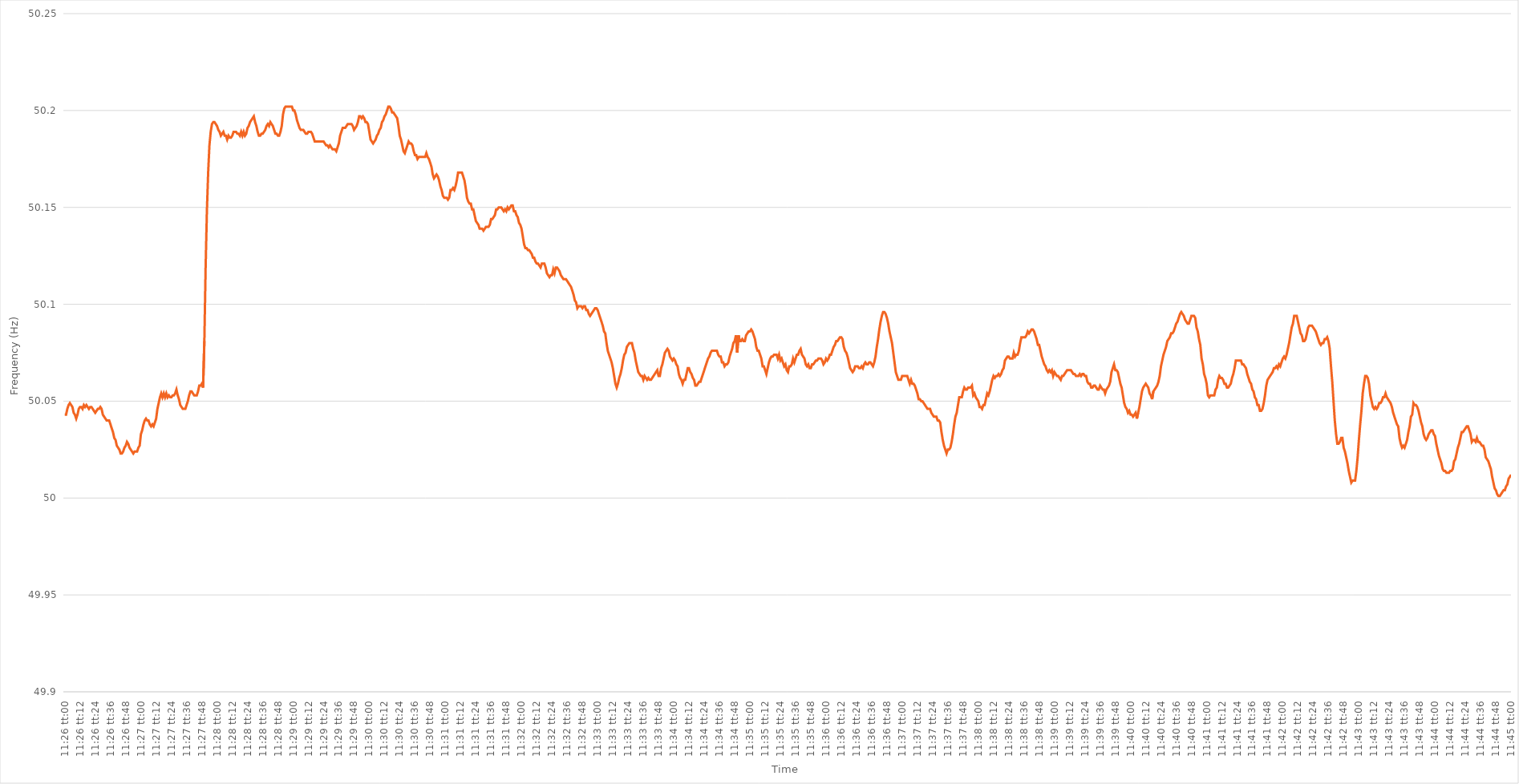
| Category | Series 0 |
|---|---|
| 0.4763888888888889 | 50.043 |
| 0.47640046296296296 | 50.043 |
| 0.47641203703703705 | 50.046 |
| 0.4764236111111111 | 50.048 |
| 0.4764351851851852 | 50.049 |
| 0.4764467592592592 | 50.048 |
| 0.4764583333333334 | 50.047 |
| 0.4764699074074074 | 50.044 |
| 0.4764814814814815 | 50.043 |
| 0.47649305555555554 | 50.041 |
| 0.47650462962962964 | 50.043 |
| 0.4765162037037037 | 50.046 |
| 0.47652777777777783 | 50.047 |
| 0.47653935185185187 | 50.047 |
| 0.47655092592592596 | 50.046 |
| 0.4765625 | 50.048 |
| 0.47657407407407404 | 50.047 |
| 0.47658564814814813 | 50.048 |
| 0.47659722222222217 | 50.047 |
| 0.4766087962962963 | 50.046 |
| 0.47662037037037036 | 50.047 |
| 0.47663194444444446 | 50.047 |
| 0.4766435185185185 | 50.046 |
| 0.4766550925925926 | 50.045 |
| 0.4766666666666666 | 50.044 |
| 0.4766782407407408 | 50.045 |
| 0.4766898148148148 | 50.046 |
| 0.4767013888888889 | 50.046 |
| 0.47671296296296295 | 50.047 |
| 0.47672453703703704 | 50.046 |
| 0.4767361111111111 | 50.043 |
| 0.47674768518518523 | 50.042 |
| 0.47675925925925927 | 50.041 |
| 0.47677083333333337 | 50.04 |
| 0.4767824074074074 | 50.04 |
| 0.4767939814814815 | 50.04 |
| 0.47680555555555554 | 50.038 |
| 0.4768171296296296 | 50.036 |
| 0.4768287037037037 | 50.034 |
| 0.47684027777777777 | 50.031 |
| 0.47685185185185186 | 50.03 |
| 0.4768634259259259 | 50.027 |
| 0.476875 | 50.026 |
| 0.47688657407407403 | 50.025 |
| 0.4768981481481482 | 50.023 |
| 0.4769097222222222 | 50.023 |
| 0.4769212962962963 | 50.024 |
| 0.47693287037037035 | 50.026 |
| 0.47694444444444445 | 50.027 |
| 0.4769560185185185 | 50.029 |
| 0.47696759259259264 | 50.028 |
| 0.4769791666666667 | 50.026 |
| 0.47699074074074077 | 50.025 |
| 0.4770023148148148 | 50.024 |
| 0.4770138888888889 | 50.023 |
| 0.47702546296296294 | 50.024 |
| 0.477037037037037 | 50.024 |
| 0.47704861111111113 | 50.024 |
| 0.47706018518518517 | 50.026 |
| 0.47707175925925926 | 50.027 |
| 0.4770833333333333 | 50.033 |
| 0.4770949074074074 | 50.035 |
| 0.47710648148148144 | 50.038 |
| 0.4771180555555556 | 50.04 |
| 0.4771296296296296 | 50.041 |
| 0.4771412037037037 | 50.04 |
| 0.47715277777777776 | 50.04 |
| 0.47716435185185185 | 50.038 |
| 0.4771759259259259 | 50.037 |
| 0.47718750000000004 | 50.038 |
| 0.4771990740740741 | 50.037 |
| 0.4772106481481482 | 50.039 |
| 0.4772222222222222 | 50.041 |
| 0.4772337962962963 | 50.046 |
| 0.47724537037037035 | 50.049 |
| 0.4772569444444445 | 50.052 |
| 0.47726851851851854 | 50.054 |
| 0.47728009259259263 | 50.052 |
| 0.47729166666666667 | 50.054 |
| 0.4773032407407407 | 50.052 |
| 0.4773148148148148 | 50.054 |
| 0.47732638888888884 | 50.052 |
| 0.477337962962963 | 50.053 |
| 0.47734953703703703 | 50.052 |
| 0.4773611111111111 | 50.052 |
| 0.47737268518518516 | 50.053 |
| 0.47738425925925926 | 50.053 |
| 0.4773958333333333 | 50.054 |
| 0.47740740740740745 | 50.056 |
| 0.4774189814814815 | 50.053 |
| 0.4774305555555556 | 50.051 |
| 0.4774421296296296 | 50.048 |
| 0.4774537037037037 | 50.047 |
| 0.47746527777777775 | 50.046 |
| 0.4774768518518519 | 50.046 |
| 0.47748842592592594 | 50.046 |
| 0.47750000000000004 | 50.048 |
| 0.4775115740740741 | 50.05 |
| 0.4775231481481481 | 50.053 |
| 0.4775347222222222 | 50.055 |
| 0.47754629629629625 | 50.055 |
| 0.4775578703703704 | 50.054 |
| 0.47756944444444444 | 50.053 |
| 0.47758101851851853 | 50.053 |
| 0.47759259259259257 | 50.053 |
| 0.47760416666666666 | 50.055 |
| 0.4776157407407407 | 50.058 |
| 0.47762731481481485 | 50.058 |
| 0.4776388888888889 | 50.059 |
| 0.477650462962963 | 50.057 |
| 0.477662037037037 | 50.081 |
| 0.4776736111111111 | 50.119 |
| 0.47768518518518516 | 50.148 |
| 0.4776967592592593 | 50.168 |
| 0.47770833333333335 | 50.182 |
| 0.47771990740740744 | 50.189 |
| 0.4777314814814815 | 50.193 |
| 0.4777430555555555 | 50.194 |
| 0.4777546296296296 | 50.194 |
| 0.47776620370370365 | 50.193 |
| 0.4777777777777778 | 50.192 |
| 0.47778935185185184 | 50.19 |
| 0.47780092592592593 | 50.189 |
| 0.4778125 | 50.187 |
| 0.47782407407407407 | 50.188 |
| 0.4778356481481481 | 50.189 |
| 0.47784722222222226 | 50.187 |
| 0.4778587962962963 | 50.187 |
| 0.4778703703703704 | 50.185 |
| 0.47788194444444443 | 50.187 |
| 0.4778935185185185 | 50.186 |
| 0.47790509259259256 | 50.186 |
| 0.4779166666666667 | 50.187 |
| 0.47792824074074075 | 50.189 |
| 0.47793981481481485 | 50.189 |
| 0.4779513888888889 | 50.189 |
| 0.477962962962963 | 50.188 |
| 0.477974537037037 | 50.188 |
| 0.47798611111111117 | 50.187 |
| 0.4779976851851852 | 50.189 |
| 0.47800925925925924 | 50.187 |
| 0.47802083333333334 | 50.189 |
| 0.4780324074074074 | 50.187 |
| 0.4780439814814815 | 50.188 |
| 0.4780555555555555 | 50.191 |
| 0.47806712962962966 | 50.192 |
| 0.4780787037037037 | 50.194 |
| 0.4780902777777778 | 50.195 |
| 0.47810185185185183 | 50.196 |
| 0.47811342592592593 | 50.197 |
| 0.47812499999999997 | 50.194 |
| 0.4781365740740741 | 50.192 |
| 0.47814814814814816 | 50.189 |
| 0.47815972222222225 | 50.187 |
| 0.4781712962962963 | 50.187 |
| 0.4781828703703704 | 50.188 |
| 0.4781944444444444 | 50.188 |
| 0.47820601851851857 | 50.189 |
| 0.4782175925925926 | 50.19 |
| 0.47822916666666665 | 50.192 |
| 0.47824074074074074 | 50.193 |
| 0.4782523148148148 | 50.192 |
| 0.4782638888888889 | 50.194 |
| 0.4782754629629629 | 50.193 |
| 0.47828703703703707 | 50.192 |
| 0.4782986111111111 | 50.19 |
| 0.4783101851851852 | 50.188 |
| 0.47832175925925924 | 50.188 |
| 0.47833333333333333 | 50.187 |
| 0.47834490740740737 | 50.187 |
| 0.4783564814814815 | 50.189 |
| 0.47836805555555556 | 50.192 |
| 0.47837962962962965 | 50.198 |
| 0.4783912037037037 | 50.201 |
| 0.4784027777777778 | 50.202 |
| 0.4784143518518518 | 50.202 |
| 0.478425925925926 | 50.202 |
| 0.4784375 | 50.202 |
| 0.47844907407407405 | 50.202 |
| 0.47846064814814815 | 50.202 |
| 0.4784722222222222 | 50.2 |
| 0.4784837962962963 | 50.2 |
| 0.4784953703703703 | 50.198 |
| 0.47850694444444447 | 50.195 |
| 0.4785185185185185 | 50.193 |
| 0.4785300925925926 | 50.191 |
| 0.47854166666666664 | 50.19 |
| 0.47855324074074074 | 50.19 |
| 0.4785648148148148 | 50.19 |
| 0.4785763888888889 | 50.189 |
| 0.47858796296296297 | 50.188 |
| 0.47859953703703706 | 50.188 |
| 0.4786111111111111 | 50.189 |
| 0.4786226851851852 | 50.189 |
| 0.47863425925925923 | 50.189 |
| 0.4786458333333334 | 50.188 |
| 0.4786574074074074 | 50.186 |
| 0.4786689814814815 | 50.184 |
| 0.47868055555555555 | 50.184 |
| 0.47869212962962965 | 50.184 |
| 0.4787037037037037 | 50.184 |
| 0.4787152777777777 | 50.184 |
| 0.4787268518518519 | 50.184 |
| 0.4787384259259259 | 50.184 |
| 0.47875 | 50.184 |
| 0.47876157407407405 | 50.183 |
| 0.47877314814814814 | 50.182 |
| 0.4787847222222222 | 50.182 |
| 0.47879629629629633 | 50.181 |
| 0.47880787037037037 | 50.182 |
| 0.47881944444444446 | 50.181 |
| 0.4788310185185185 | 50.18 |
| 0.4788425925925926 | 50.18 |
| 0.47885416666666664 | 50.18 |
| 0.4788657407407408 | 50.179 |
| 0.4788773148148148 | 50.181 |
| 0.4788888888888889 | 50.183 |
| 0.47890046296296296 | 50.187 |
| 0.47891203703703705 | 50.189 |
| 0.4789236111111111 | 50.191 |
| 0.47893518518518513 | 50.191 |
| 0.4789467592592593 | 50.191 |
| 0.4789583333333333 | 50.192 |
| 0.4789699074074074 | 50.193 |
| 0.47898148148148145 | 50.193 |
| 0.47899305555555555 | 50.193 |
| 0.4790046296296296 | 50.193 |
| 0.47901620370370374 | 50.192 |
| 0.4790277777777778 | 50.19 |
| 0.47903935185185187 | 50.191 |
| 0.4790509259259259 | 50.192 |
| 0.4790625 | 50.194 |
| 0.47907407407407404 | 50.197 |
| 0.4790856481481482 | 50.197 |
| 0.47909722222222223 | 50.196 |
| 0.4791087962962963 | 50.197 |
| 0.47912037037037036 | 50.196 |
| 0.47913194444444446 | 50.194 |
| 0.4791435185185185 | 50.194 |
| 0.47915509259259265 | 50.193 |
| 0.4791666666666667 | 50.189 |
| 0.4791782407407407 | 50.185 |
| 0.4791898148148148 | 50.184 |
| 0.47920138888888886 | 50.183 |
| 0.47921296296296295 | 50.184 |
| 0.479224537037037 | 50.185 |
| 0.47923611111111114 | 50.187 |
| 0.4792476851851852 | 50.188 |
| 0.4792592592592593 | 50.19 |
| 0.4792708333333333 | 50.191 |
| 0.4792824074074074 | 50.194 |
| 0.47929398148148145 | 50.195 |
| 0.4793055555555556 | 50.197 |
| 0.47931712962962963 | 50.198 |
| 0.47932870370370373 | 50.2 |
| 0.47934027777777777 | 50.202 |
| 0.47935185185185186 | 50.202 |
| 0.4793634259259259 | 50.201 |
| 0.47937500000000005 | 50.199 |
| 0.4793865740740741 | 50.199 |
| 0.4793981481481482 | 50.198 |
| 0.4794097222222222 | 50.197 |
| 0.47942129629629626 | 50.196 |
| 0.47943287037037036 | 50.192 |
| 0.4794444444444444 | 50.187 |
| 0.47945601851851855 | 50.185 |
| 0.4794675925925926 | 50.182 |
| 0.4794791666666667 | 50.179 |
| 0.4794907407407407 | 50.178 |
| 0.4795023148148148 | 50.18 |
| 0.47951388888888885 | 50.182 |
| 0.479525462962963 | 50.184 |
| 0.47953703703703704 | 50.183 |
| 0.47954861111111113 | 50.183 |
| 0.4795601851851852 | 50.182 |
| 0.47957175925925927 | 50.179 |
| 0.4795833333333333 | 50.177 |
| 0.47959490740740746 | 50.177 |
| 0.4796064814814815 | 50.175 |
| 0.4796180555555556 | 50.176 |
| 0.47962962962962963 | 50.176 |
| 0.47964120370370367 | 50.176 |
| 0.47965277777777776 | 50.176 |
| 0.4796643518518518 | 50.176 |
| 0.47967592592592595 | 50.176 |
| 0.4796875 | 50.178 |
| 0.4796990740740741 | 50.176 |
| 0.4797106481481481 | 50.175 |
| 0.4797222222222222 | 50.173 |
| 0.47973379629629626 | 50.171 |
| 0.4797453703703704 | 50.167 |
| 0.47975694444444444 | 50.165 |
| 0.47976851851851854 | 50.166 |
| 0.4797800925925926 | 50.167 |
| 0.47979166666666667 | 50.166 |
| 0.4798032407407407 | 50.164 |
| 0.47981481481481486 | 50.161 |
| 0.4798263888888889 | 50.159 |
| 0.479837962962963 | 50.156 |
| 0.47984953703703703 | 50.155 |
| 0.4798611111111111 | 50.155 |
| 0.47987268518518517 | 50.155 |
| 0.4798842592592593 | 50.154 |
| 0.47989583333333335 | 50.155 |
| 0.4799074074074074 | 50.159 |
| 0.4799189814814815 | 50.159 |
| 0.4799305555555555 | 50.16 |
| 0.4799421296296296 | 50.159 |
| 0.47995370370370366 | 50.161 |
| 0.4799652777777778 | 50.164 |
| 0.47997685185185185 | 50.168 |
| 0.47998842592592594 | 50.168 |
| 0.48 | 50.168 |
| 0.4800115740740741 | 50.168 |
| 0.4800231481481481 | 50.166 |
| 0.48003472222222227 | 50.164 |
| 0.4800462962962963 | 50.16 |
| 0.4800578703703704 | 50.155 |
| 0.48006944444444444 | 50.153 |
| 0.48008101851851853 | 50.152 |
| 0.48009259259259257 | 50.152 |
| 0.4801041666666667 | 50.149 |
| 0.48011574074074076 | 50.149 |
| 0.4801273148148148 | 50.146 |
| 0.4801388888888889 | 50.143 |
| 0.48015046296296293 | 50.142 |
| 0.480162037037037 | 50.141 |
| 0.48017361111111106 | 50.139 |
| 0.4801851851851852 | 50.139 |
| 0.48019675925925925 | 50.139 |
| 0.48020833333333335 | 50.138 |
| 0.4802199074074074 | 50.139 |
| 0.4802314814814815 | 50.14 |
| 0.4802430555555555 | 50.14 |
| 0.48025462962962967 | 50.14 |
| 0.4802662037037037 | 50.141 |
| 0.4802777777777778 | 50.144 |
| 0.48028935185185184 | 50.144 |
| 0.48030092592592594 | 50.145 |
| 0.4803125 | 50.146 |
| 0.4803240740740741 | 50.149 |
| 0.48033564814814816 | 50.149 |
| 0.4803472222222222 | 50.15 |
| 0.4803587962962963 | 50.15 |
| 0.48037037037037034 | 50.15 |
| 0.48038194444444443 | 50.149 |
| 0.48039351851851847 | 50.148 |
| 0.4804050925925926 | 50.149 |
| 0.48041666666666666 | 50.148 |
| 0.48042824074074075 | 50.15 |
| 0.4804398148148148 | 50.149 |
| 0.4804513888888889 | 50.15 |
| 0.4804629629629629 | 50.151 |
| 0.4804745370370371 | 50.151 |
| 0.4804861111111111 | 50.148 |
| 0.4804976851851852 | 50.148 |
| 0.48050925925925925 | 50.146 |
| 0.48052083333333334 | 50.145 |
| 0.4805324074074074 | 50.142 |
| 0.48054398148148153 | 50.141 |
| 0.48055555555555557 | 50.139 |
| 0.48056712962962966 | 50.135 |
| 0.4805787037037037 | 50.131 |
| 0.48059027777777774 | 50.129 |
| 0.48060185185185184 | 50.129 |
| 0.4806134259259259 | 50.128 |
| 0.480625 | 50.128 |
| 0.48063657407407406 | 50.127 |
| 0.48064814814814816 | 50.126 |
| 0.4806597222222222 | 50.124 |
| 0.4806712962962963 | 50.124 |
| 0.48068287037037033 | 50.122 |
| 0.4806944444444445 | 50.121 |
| 0.4807060185185185 | 50.121 |
| 0.4807175925925926 | 50.12 |
| 0.48072916666666665 | 50.119 |
| 0.48074074074074075 | 50.121 |
| 0.4807523148148148 | 50.121 |
| 0.48076388888888894 | 50.121 |
| 0.480775462962963 | 50.119 |
| 0.48078703703703707 | 50.116 |
| 0.4807986111111111 | 50.115 |
| 0.4808101851851852 | 50.114 |
| 0.48082175925925924 | 50.115 |
| 0.4808333333333333 | 50.115 |
| 0.48084490740740743 | 50.118 |
| 0.48085648148148147 | 50.116 |
| 0.48086805555555556 | 50.119 |
| 0.4808796296296296 | 50.119 |
| 0.4808912037037037 | 50.118 |
| 0.48090277777777773 | 50.117 |
| 0.4809143518518519 | 50.115 |
| 0.4809259259259259 | 50.114 |
| 0.4809375 | 50.113 |
| 0.48094907407407406 | 50.113 |
| 0.48096064814814815 | 50.113 |
| 0.4809722222222222 | 50.112 |
| 0.48098379629629634 | 50.111 |
| 0.4809953703703704 | 50.11 |
| 0.4810069444444445 | 50.109 |
| 0.4810185185185185 | 50.107 |
| 0.4810300925925926 | 50.105 |
| 0.48104166666666665 | 50.102 |
| 0.4810532407407408 | 50.101 |
| 0.48106481481481483 | 50.098 |
| 0.4810763888888889 | 50.099 |
| 0.48108796296296297 | 50.099 |
| 0.481099537037037 | 50.099 |
| 0.4811111111111111 | 50.098 |
| 0.48112268518518514 | 50.099 |
| 0.4811342592592593 | 50.099 |
| 0.48114583333333333 | 50.097 |
| 0.4811574074074074 | 50.097 |
| 0.48116898148148146 | 50.095 |
| 0.48118055555555556 | 50.094 |
| 0.4811921296296296 | 50.095 |
| 0.48120370370370374 | 50.096 |
| 0.4812152777777778 | 50.097 |
| 0.4812268518518519 | 50.098 |
| 0.4812384259259259 | 50.098 |
| 0.48125 | 50.097 |
| 0.48126157407407405 | 50.095 |
| 0.4812731481481482 | 50.093 |
| 0.48128472222222224 | 50.091 |
| 0.48129629629629633 | 50.089 |
| 0.48130787037037037 | 50.086 |
| 0.4813194444444444 | 50.085 |
| 0.4813310185185185 | 50.08 |
| 0.48134259259259254 | 50.076 |
| 0.4813541666666667 | 50.074 |
| 0.48136574074074073 | 50.072 |
| 0.4813773148148148 | 50.07 |
| 0.48138888888888887 | 50.067 |
| 0.48140046296296296 | 50.063 |
| 0.481412037037037 | 50.059 |
| 0.48142361111111115 | 50.057 |
| 0.4814351851851852 | 50.059 |
| 0.4814467592592593 | 50.062 |
| 0.4814583333333333 | 50.064 |
| 0.4814699074074074 | 50.067 |
| 0.48148148148148145 | 50.071 |
| 0.4814930555555556 | 50.074 |
| 0.48150462962962964 | 50.075 |
| 0.48151620370370374 | 50.078 |
| 0.4815277777777778 | 50.079 |
| 0.4815393518518518 | 50.08 |
| 0.4815509259259259 | 50.08 |
| 0.48156249999999995 | 50.08 |
| 0.4815740740740741 | 50.077 |
| 0.48158564814814814 | 50.075 |
| 0.48159722222222223 | 50.071 |
| 0.48160879629629627 | 50.068 |
| 0.48162037037037037 | 50.065 |
| 0.4816319444444444 | 50.064 |
| 0.48164351851851855 | 50.063 |
| 0.4816550925925926 | 50.063 |
| 0.4816666666666667 | 50.061 |
| 0.4816782407407407 | 50.063 |
| 0.4816898148148148 | 50.062 |
| 0.48170138888888886 | 50.061 |
| 0.481712962962963 | 50.062 |
| 0.48172453703703705 | 50.061 |
| 0.48173611111111114 | 50.061 |
| 0.4817476851851852 | 50.062 |
| 0.4817592592592593 | 50.063 |
| 0.4817708333333333 | 50.064 |
| 0.48178240740740735 | 50.065 |
| 0.4817939814814815 | 50.066 |
| 0.48180555555555554 | 50.063 |
| 0.48181712962962964 | 50.063 |
| 0.4818287037037037 | 50.067 |
| 0.48184027777777777 | 50.069 |
| 0.4818518518518518 | 50.072 |
| 0.48186342592592596 | 50.075 |
| 0.481875 | 50.076 |
| 0.4818865740740741 | 50.077 |
| 0.48189814814814813 | 50.076 |
| 0.4819097222222222 | 50.073 |
| 0.48192129629629626 | 50.072 |
| 0.4819328703703704 | 50.071 |
| 0.48194444444444445 | 50.072 |
| 0.48195601851851855 | 50.071 |
| 0.4819675925925926 | 50.069 |
| 0.4819791666666667 | 50.068 |
| 0.4819907407407407 | 50.064 |
| 0.48200231481481487 | 50.062 |
| 0.4820138888888889 | 50.061 |
| 0.48202546296296295 | 50.059 |
| 0.48203703703703704 | 50.061 |
| 0.4820486111111111 | 50.061 |
| 0.4820601851851852 | 50.064 |
| 0.4820717592592592 | 50.067 |
| 0.48208333333333336 | 50.067 |
| 0.4820949074074074 | 50.065 |
| 0.4821064814814815 | 50.064 |
| 0.48211805555555554 | 50.062 |
| 0.48212962962962963 | 50.061 |
| 0.48214120370370367 | 50.058 |
| 0.4821527777777778 | 50.058 |
| 0.48216435185185186 | 50.059 |
| 0.48217592592592595 | 50.06 |
| 0.4821875 | 50.06 |
| 0.4821990740740741 | 50.062 |
| 0.4822106481481481 | 50.064 |
| 0.4822222222222223 | 50.066 |
| 0.4822337962962963 | 50.068 |
| 0.48224537037037035 | 50.07 |
| 0.48225694444444445 | 50.072 |
| 0.4822685185185185 | 50.073 |
| 0.4822800925925926 | 50.075 |
| 0.4822916666666666 | 50.076 |
| 0.48230324074074077 | 50.076 |
| 0.4823148148148148 | 50.076 |
| 0.4823263888888889 | 50.076 |
| 0.48233796296296294 | 50.076 |
| 0.48234953703703703 | 50.074 |
| 0.4823611111111111 | 50.073 |
| 0.4823726851851852 | 50.073 |
| 0.48238425925925926 | 50.07 |
| 0.48239583333333336 | 50.07 |
| 0.4824074074074074 | 50.068 |
| 0.4824189814814815 | 50.069 |
| 0.48243055555555553 | 50.069 |
| 0.4824421296296297 | 50.07 |
| 0.4824537037037037 | 50.073 |
| 0.4824652777777778 | 50.075 |
| 0.48247685185185185 | 50.077 |
| 0.4824884259259259 | 50.08 |
| 0.4825 | 50.081 |
| 0.482511574074074 | 50.084 |
| 0.4825231481481482 | 50.075 |
| 0.4825347222222222 | 50.084 |
| 0.4825462962962963 | 50.081 |
| 0.48255787037037035 | 50.081 |
| 0.48256944444444444 | 50.082 |
| 0.4825810185185185 | 50.081 |
| 0.48259259259259263 | 50.081 |
| 0.48260416666666667 | 50.084 |
| 0.48261574074074076 | 50.085 |
| 0.4826273148148148 | 50.086 |
| 0.4826388888888889 | 50.086 |
| 0.48265046296296293 | 50.087 |
| 0.4826620370370371 | 50.086 |
| 0.4826736111111111 | 50.084 |
| 0.4826851851851852 | 50.082 |
| 0.48269675925925926 | 50.078 |
| 0.48270833333333335 | 50.076 |
| 0.4827199074074074 | 50.076 |
| 0.48273148148148143 | 50.074 |
| 0.4827430555555556 | 50.072 |
| 0.4827546296296296 | 50.068 |
| 0.4827662037037037 | 50.068 |
| 0.48277777777777775 | 50.066 |
| 0.48278935185185184 | 50.064 |
| 0.4828009259259259 | 50.067 |
| 0.48281250000000003 | 50.07 |
| 0.48282407407407407 | 50.072 |
| 0.48283564814814817 | 50.073 |
| 0.4828472222222222 | 50.073 |
| 0.4828587962962963 | 50.074 |
| 0.48287037037037034 | 50.074 |
| 0.4828819444444445 | 50.074 |
| 0.4828935185185185 | 50.072 |
| 0.4829050925925926 | 50.074 |
| 0.48291666666666666 | 50.071 |
| 0.48292824074074076 | 50.072 |
| 0.4829398148148148 | 50.07 |
| 0.48295138888888894 | 50.068 |
| 0.482962962962963 | 50.069 |
| 0.482974537037037 | 50.066 |
| 0.4829861111111111 | 50.065 |
| 0.48299768518518515 | 50.068 |
| 0.48300925925925925 | 50.068 |
| 0.4830208333333333 | 50.069 |
| 0.48303240740740744 | 50.072 |
| 0.4830439814814815 | 50.07 |
| 0.48305555555555557 | 50.072 |
| 0.4830671296296296 | 50.074 |
| 0.4830787037037037 | 50.074 |
| 0.48309027777777774 | 50.076 |
| 0.4831018518518519 | 50.077 |
| 0.48311342592592593 | 50.074 |
| 0.483125 | 50.073 |
| 0.48313657407407407 | 50.072 |
| 0.48314814814814816 | 50.069 |
| 0.4831597222222222 | 50.068 |
| 0.48317129629629635 | 50.069 |
| 0.4831828703703704 | 50.067 |
| 0.4831944444444444 | 50.067 |
| 0.4832060185185185 | 50.069 |
| 0.48321759259259256 | 50.069 |
| 0.48322916666666665 | 50.07 |
| 0.4832407407407407 | 50.071 |
| 0.48325231481481484 | 50.071 |
| 0.4832638888888889 | 50.072 |
| 0.483275462962963 | 50.072 |
| 0.483287037037037 | 50.072 |
| 0.4832986111111111 | 50.071 |
| 0.48331018518518515 | 50.069 |
| 0.4833217592592593 | 50.07 |
| 0.48333333333333334 | 50.072 |
| 0.48334490740740743 | 50.071 |
| 0.48335648148148147 | 50.072 |
| 0.48336805555555556 | 50.074 |
| 0.4833796296296296 | 50.074 |
| 0.48339120370370375 | 50.076 |
| 0.4834027777777778 | 50.078 |
| 0.4834143518518519 | 50.079 |
| 0.4834259259259259 | 50.081 |
| 0.48343749999999996 | 50.081 |
| 0.48344907407407406 | 50.082 |
| 0.4834606481481481 | 50.083 |
| 0.48347222222222225 | 50.083 |
| 0.4834837962962963 | 50.082 |
| 0.4834953703703704 | 50.078 |
| 0.4835069444444444 | 50.076 |
| 0.4835185185185185 | 50.075 |
| 0.48353009259259255 | 50.073 |
| 0.4835416666666667 | 50.07 |
| 0.48355324074074074 | 50.067 |
| 0.48356481481481484 | 50.066 |
| 0.4835763888888889 | 50.065 |
| 0.48358796296296297 | 50.066 |
| 0.483599537037037 | 50.068 |
| 0.48361111111111116 | 50.068 |
| 0.4836226851851852 | 50.068 |
| 0.4836342592592593 | 50.067 |
| 0.48364583333333333 | 50.067 |
| 0.4836574074074074 | 50.068 |
| 0.48366898148148146 | 50.067 |
| 0.4836805555555555 | 50.069 |
| 0.48369212962962965 | 50.07 |
| 0.4837037037037037 | 50.069 |
| 0.4837152777777778 | 50.069 |
| 0.4837268518518518 | 50.07 |
| 0.4837384259259259 | 50.07 |
| 0.48374999999999996 | 50.069 |
| 0.4837615740740741 | 50.068 |
| 0.48377314814814815 | 50.07 |
| 0.48378472222222224 | 50.073 |
| 0.4837962962962963 | 50.078 |
| 0.4838078703703704 | 50.082 |
| 0.4838194444444444 | 50.087 |
| 0.48383101851851856 | 50.091 |
| 0.4838425925925926 | 50.094 |
| 0.4838541666666667 | 50.096 |
| 0.48386574074074074 | 50.096 |
| 0.48387731481481483 | 50.095 |
| 0.48388888888888887 | 50.093 |
| 0.483900462962963 | 50.09 |
| 0.48391203703703706 | 50.086 |
| 0.4839236111111111 | 50.083 |
| 0.4839351851851852 | 50.08 |
| 0.48394675925925923 | 50.075 |
| 0.4839583333333333 | 50.07 |
| 0.48396990740740736 | 50.065 |
| 0.4839814814814815 | 50.063 |
| 0.48399305555555555 | 50.061 |
| 0.48400462962962965 | 50.061 |
| 0.4840162037037037 | 50.061 |
| 0.4840277777777778 | 50.063 |
| 0.4840393518518518 | 50.063 |
| 0.48405092592592597 | 50.063 |
| 0.4840625 | 50.063 |
| 0.4840740740740741 | 50.063 |
| 0.48408564814814814 | 50.061 |
| 0.48409722222222223 | 50.059 |
| 0.4841087962962963 | 50.061 |
| 0.4841203703703704 | 50.059 |
| 0.48413194444444446 | 50.059 |
| 0.4841435185185185 | 50.058 |
| 0.4841550925925926 | 50.056 |
| 0.48416666666666663 | 50.054 |
| 0.48417824074074073 | 50.051 |
| 0.48418981481481477 | 50.051 |
| 0.4842013888888889 | 50.05 |
| 0.48421296296296296 | 50.05 |
| 0.48422453703703705 | 50.049 |
| 0.4842361111111111 | 50.048 |
| 0.4842476851851852 | 50.047 |
| 0.4842592592592592 | 50.046 |
| 0.4842708333333334 | 50.046 |
| 0.4842824074074074 | 50.046 |
| 0.4842939814814815 | 50.044 |
| 0.48430555555555554 | 50.043 |
| 0.48431712962962964 | 50.042 |
| 0.4843287037037037 | 50.042 |
| 0.48434027777777783 | 50.042 |
| 0.48435185185185187 | 50.04 |
| 0.48436342592592596 | 50.04 |
| 0.484375 | 50.039 |
| 0.48438657407407404 | 50.034 |
| 0.48439814814814813 | 50.03 |
| 0.48440972222222217 | 50.027 |
| 0.4844212962962963 | 50.025 |
| 0.48443287037037036 | 50.023 |
| 0.48444444444444446 | 50.025 |
| 0.4844560185185185 | 50.025 |
| 0.4844675925925926 | 50.026 |
| 0.4844791666666666 | 50.029 |
| 0.4844907407407408 | 50.033 |
| 0.4845023148148148 | 50.038 |
| 0.4845138888888889 | 50.042 |
| 0.48452546296296295 | 50.044 |
| 0.48453703703703704 | 50.048 |
| 0.4845486111111111 | 50.052 |
| 0.48456018518518523 | 50.052 |
| 0.48457175925925927 | 50.052 |
| 0.48458333333333337 | 50.055 |
| 0.4845949074074074 | 50.057 |
| 0.4846064814814815 | 50.056 |
| 0.48461805555555554 | 50.056 |
| 0.4846296296296296 | 50.057 |
| 0.4846412037037037 | 50.057 |
| 0.48465277777777777 | 50.057 |
| 0.48466435185185186 | 50.058 |
| 0.4846759259259259 | 50.053 |
| 0.4846875 | 50.054 |
| 0.48469907407407403 | 50.052 |
| 0.4847106481481482 | 50.051 |
| 0.4847222222222222 | 50.05 |
| 0.4847337962962963 | 50.047 |
| 0.48474537037037035 | 50.047 |
| 0.48475694444444445 | 50.046 |
| 0.4847685185185185 | 50.048 |
| 0.48478009259259264 | 50.048 |
| 0.4847916666666667 | 50.051 |
| 0.48480324074074077 | 50.054 |
| 0.4848148148148148 | 50.053 |
| 0.4848263888888889 | 50.055 |
| 0.48483796296296294 | 50.058 |
| 0.484849537037037 | 50.061 |
| 0.48486111111111113 | 50.063 |
| 0.48487268518518517 | 50.062 |
| 0.48488425925925926 | 50.063 |
| 0.4848958333333333 | 50.063 |
| 0.4849074074074074 | 50.064 |
| 0.48491898148148144 | 50.063 |
| 0.4849305555555556 | 50.064 |
| 0.4849421296296296 | 50.066 |
| 0.4849537037037037 | 50.067 |
| 0.48496527777777776 | 50.071 |
| 0.48497685185185185 | 50.072 |
| 0.4849884259259259 | 50.073 |
| 0.48500000000000004 | 50.073 |
| 0.4850115740740741 | 50.072 |
| 0.4850231481481482 | 50.072 |
| 0.4850347222222222 | 50.072 |
| 0.4850462962962963 | 50.075 |
| 0.48505787037037035 | 50.073 |
| 0.4850694444444445 | 50.074 |
| 0.48508101851851854 | 50.074 |
| 0.4850925925925926 | 50.076 |
| 0.48510416666666667 | 50.08 |
| 0.4851157407407407 | 50.083 |
| 0.4851273148148148 | 50.083 |
| 0.48513888888888884 | 50.083 |
| 0.485150462962963 | 50.083 |
| 0.48516203703703703 | 50.084 |
| 0.4851736111111111 | 50.086 |
| 0.48518518518518516 | 50.085 |
| 0.48519675925925926 | 50.086 |
| 0.4852083333333333 | 50.087 |
| 0.48521990740740745 | 50.087 |
| 0.4852314814814815 | 50.086 |
| 0.4852430555555556 | 50.084 |
| 0.4852546296296296 | 50.082 |
| 0.4852662037037037 | 50.079 |
| 0.48527777777777775 | 50.079 |
| 0.4852893518518519 | 50.076 |
| 0.48530092592592594 | 50.073 |
| 0.48531250000000004 | 50.071 |
| 0.4853240740740741 | 50.069 |
| 0.4853356481481481 | 50.068 |
| 0.4853472222222222 | 50.066 |
| 0.48535879629629625 | 50.065 |
| 0.4853703703703704 | 50.066 |
| 0.48538194444444444 | 50.065 |
| 0.48539351851851853 | 50.066 |
| 0.48540509259259257 | 50.063 |
| 0.48541666666666666 | 50.065 |
| 0.4854282407407407 | 50.064 |
| 0.48543981481481485 | 50.063 |
| 0.4854513888888889 | 50.063 |
| 0.485462962962963 | 50.062 |
| 0.485474537037037 | 50.061 |
| 0.4854861111111111 | 50.063 |
| 0.48549768518518516 | 50.063 |
| 0.4855092592592593 | 50.064 |
| 0.48552083333333335 | 50.065 |
| 0.48553240740740744 | 50.066 |
| 0.4855439814814815 | 50.066 |
| 0.4855555555555556 | 50.066 |
| 0.4855671296296296 | 50.066 |
| 0.48557870370370365 | 50.065 |
| 0.4855902777777778 | 50.064 |
| 0.48560185185185184 | 50.064 |
| 0.48561342592592593 | 50.063 |
| 0.485625 | 50.063 |
| 0.48563657407407407 | 50.063 |
| 0.4856481481481481 | 50.064 |
| 0.48565972222222226 | 50.063 |
| 0.4856712962962963 | 50.064 |
| 0.4856828703703704 | 50.064 |
| 0.48569444444444443 | 50.063 |
| 0.4857060185185185 | 50.063 |
| 0.48571759259259256 | 50.06 |
| 0.4857291666666667 | 50.059 |
| 0.48574074074074075 | 50.059 |
| 0.48575231481481485 | 50.057 |
| 0.4857638888888889 | 50.057 |
| 0.485775462962963 | 50.058 |
| 0.485787037037037 | 50.058 |
| 0.48579861111111106 | 50.057 |
| 0.4858101851851852 | 50.056 |
| 0.48582175925925924 | 50.056 |
| 0.48583333333333334 | 50.058 |
| 0.4858449074074074 | 50.057 |
| 0.4858564814814815 | 50.056 |
| 0.4858680555555555 | 50.056 |
| 0.48587962962962966 | 50.054 |
| 0.4858912037037037 | 50.056 |
| 0.4859027777777778 | 50.057 |
| 0.48591435185185183 | 50.058 |
| 0.48592592592592593 | 50.06 |
| 0.48593749999999997 | 50.065 |
| 0.4859490740740741 | 50.067 |
| 0.48596064814814816 | 50.069 |
| 0.48597222222222225 | 50.066 |
| 0.4859837962962963 | 50.066 |
| 0.4859953703703704 | 50.065 |
| 0.4860069444444444 | 50.062 |
| 0.48601851851851857 | 50.059 |
| 0.4860300925925926 | 50.057 |
| 0.48604166666666665 | 50.053 |
| 0.48605324074074074 | 50.049 |
| 0.4860648148148148 | 50.047 |
| 0.4860763888888889 | 50.046 |
| 0.4860879629629629 | 50.044 |
| 0.48609953703703707 | 50.045 |
| 0.4861111111111111 | 50.043 |
| 0.4861226851851852 | 50.043 |
| 0.48613425925925924 | 50.042 |
| 0.48614583333333333 | 50.043 |
| 0.48615740740740737 | 50.044 |
| 0.4861689814814815 | 50.041 |
| 0.48618055555555556 | 50.044 |
| 0.48619212962962965 | 50.047 |
| 0.4862037037037037 | 50.051 |
| 0.4862152777777778 | 50.055 |
| 0.4862268518518518 | 50.057 |
| 0.486238425925926 | 50.058 |
| 0.48625 | 50.059 |
| 0.4862615740740741 | 50.058 |
| 0.48627314814814815 | 50.057 |
| 0.4862847222222222 | 50.054 |
| 0.4862962962962963 | 50.053 |
| 0.4863078703703703 | 50.051 |
| 0.48631944444444447 | 50.055 |
| 0.4863310185185185 | 50.056 |
| 0.4863425925925926 | 50.057 |
| 0.48635416666666664 | 50.058 |
| 0.48636574074074074 | 50.06 |
| 0.4863773148148148 | 50.063 |
| 0.4863888888888889 | 50.068 |
| 0.48640046296296297 | 50.071 |
| 0.48641203703703706 | 50.074 |
| 0.4864236111111111 | 50.076 |
| 0.4864351851851852 | 50.078 |
| 0.48644675925925923 | 50.081 |
| 0.4864583333333334 | 50.082 |
| 0.4864699074074074 | 50.083 |
| 0.4864814814814815 | 50.085 |
| 0.48649305555555555 | 50.085 |
| 0.48650462962962965 | 50.086 |
| 0.4865162037037037 | 50.088 |
| 0.4865277777777777 | 50.09 |
| 0.4865393518518519 | 50.091 |
| 0.4865509259259259 | 50.093 |
| 0.4865625 | 50.095 |
| 0.48657407407407405 | 50.096 |
| 0.48658564814814814 | 50.095 |
| 0.4865972222222222 | 50.094 |
| 0.48660879629629633 | 50.092 |
| 0.48662037037037037 | 50.091 |
| 0.48663194444444446 | 50.09 |
| 0.4866435185185185 | 50.09 |
| 0.4866550925925926 | 50.092 |
| 0.48666666666666664 | 50.094 |
| 0.4866782407407408 | 50.094 |
| 0.4866898148148148 | 50.094 |
| 0.4867013888888889 | 50.093 |
| 0.48671296296296296 | 50.088 |
| 0.48672453703703705 | 50.086 |
| 0.4867361111111111 | 50.082 |
| 0.48674768518518513 | 50.079 |
| 0.4867592592592593 | 50.072 |
| 0.4867708333333333 | 50.069 |
| 0.4867824074074074 | 50.064 |
| 0.48679398148148145 | 50.062 |
| 0.48680555555555555 | 50.059 |
| 0.4868171296296296 | 50.053 |
| 0.48682870370370374 | 50.052 |
| 0.4868402777777778 | 50.053 |
| 0.48685185185185187 | 50.053 |
| 0.4868634259259259 | 50.053 |
| 0.486875 | 50.053 |
| 0.48688657407407404 | 50.056 |
| 0.4868981481481482 | 50.057 |
| 0.48690972222222223 | 50.061 |
| 0.4869212962962963 | 50.063 |
| 0.48693287037037036 | 50.062 |
| 0.48694444444444446 | 50.062 |
| 0.4869560185185185 | 50.061 |
| 0.48696759259259265 | 50.059 |
| 0.4869791666666667 | 50.059 |
| 0.4869907407407407 | 50.057 |
| 0.4870023148148148 | 50.057 |
| 0.48701388888888886 | 50.058 |
| 0.48702546296296295 | 50.059 |
| 0.487037037037037 | 50.062 |
| 0.48704861111111114 | 50.064 |
| 0.4870601851851852 | 50.067 |
| 0.4870717592592593 | 50.071 |
| 0.4870833333333333 | 50.071 |
| 0.4870949074074074 | 50.071 |
| 0.48710648148148145 | 50.071 |
| 0.4871180555555556 | 50.071 |
| 0.48712962962962963 | 50.069 |
| 0.48714120370370373 | 50.069 |
| 0.48715277777777777 | 50.068 |
| 0.48716435185185186 | 50.067 |
| 0.4871759259259259 | 50.064 |
| 0.48718750000000005 | 50.062 |
| 0.4871990740740741 | 50.06 |
| 0.4872106481481482 | 50.059 |
| 0.4872222222222222 | 50.056 |
| 0.48723379629629626 | 50.055 |
| 0.48724537037037036 | 50.052 |
| 0.4872569444444444 | 50.051 |
| 0.48726851851851855 | 50.048 |
| 0.4872800925925926 | 50.048 |
| 0.4872916666666667 | 50.045 |
| 0.4873032407407407 | 50.045 |
| 0.4873148148148148 | 50.046 |
| 0.48732638888888885 | 50.049 |
| 0.487337962962963 | 50.053 |
| 0.48734953703703704 | 50.058 |
| 0.48736111111111113 | 50.061 |
| 0.4873726851851852 | 50.062 |
| 0.48738425925925927 | 50.063 |
| 0.4873958333333333 | 50.064 |
| 0.48740740740740746 | 50.065 |
| 0.4874189814814815 | 50.067 |
| 0.4874305555555556 | 50.067 |
| 0.48744212962962963 | 50.068 |
| 0.48745370370370367 | 50.067 |
| 0.48746527777777776 | 50.069 |
| 0.4874768518518518 | 50.068 |
| 0.48748842592592595 | 50.07 |
| 0.4875 | 50.072 |
| 0.4875115740740741 | 50.073 |
| 0.4875231481481481 | 50.072 |
| 0.4875347222222222 | 50.074 |
| 0.48754629629629626 | 50.077 |
| 0.4875578703703704 | 50.08 |
| 0.48756944444444444 | 50.084 |
| 0.48758101851851854 | 50.088 |
| 0.4875925925925926 | 50.09 |
| 0.48760416666666667 | 50.094 |
| 0.4876157407407407 | 50.094 |
| 0.48762731481481486 | 50.094 |
| 0.4876388888888889 | 50.091 |
| 0.487650462962963 | 50.088 |
| 0.48766203703703703 | 50.085 |
| 0.4876736111111111 | 50.084 |
| 0.48768518518518517 | 50.081 |
| 0.4876967592592592 | 50.081 |
| 0.48770833333333335 | 50.082 |
| 0.4877199074074074 | 50.085 |
| 0.4877314814814815 | 50.088 |
| 0.4877430555555555 | 50.089 |
| 0.4877546296296296 | 50.089 |
| 0.48776620370370366 | 50.089 |
| 0.4877777777777778 | 50.088 |
| 0.48778935185185185 | 50.087 |
| 0.48780092592592594 | 50.086 |
| 0.4878125 | 50.084 |
| 0.4878240740740741 | 50.082 |
| 0.4878356481481481 | 50.08 |
| 0.48784722222222227 | 50.079 |
| 0.4878587962962963 | 50.08 |
| 0.4878703703703704 | 50.08 |
| 0.48788194444444444 | 50.082 |
| 0.48789351851851853 | 50.082 |
| 0.48790509259259257 | 50.083 |
| 0.4879166666666667 | 50.081 |
| 0.48792824074074076 | 50.077 |
| 0.4879398148148148 | 50.068 |
| 0.4879513888888889 | 50.06 |
| 0.48796296296296293 | 50.05 |
| 0.487974537037037 | 50.04 |
| 0.48798611111111106 | 50.033 |
| 0.4879976851851852 | 50.028 |
| 0.48800925925925925 | 50.028 |
| 0.48802083333333335 | 50.029 |
| 0.4880324074074074 | 50.031 |
| 0.4880439814814815 | 50.031 |
| 0.4880555555555555 | 50.026 |
| 0.48806712962962967 | 50.024 |
| 0.4880787037037037 | 50.021 |
| 0.4880902777777778 | 50.018 |
| 0.48810185185185184 | 50.014 |
| 0.48811342592592594 | 50.011 |
| 0.488125 | 50.008 |
| 0.4881365740740741 | 50.009 |
| 0.48814814814814816 | 50.009 |
| 0.48815972222222226 | 50.009 |
| 0.4881712962962963 | 50.014 |
| 0.48818287037037034 | 50.021 |
| 0.48819444444444443 | 50.03 |
| 0.48820601851851847 | 50.038 |
| 0.4882175925925926 | 50.045 |
| 0.48822916666666666 | 50.054 |
| 0.48824074074074075 | 50.059 |
| 0.4882523148148148 | 50.063 |
| 0.4882638888888889 | 50.063 |
| 0.4882754629629629 | 50.062 |
| 0.4882870370370371 | 50.059 |
| 0.4882986111111111 | 50.053 |
| 0.4883101851851852 | 50.05 |
| 0.48832175925925925 | 50.047 |
| 0.48833333333333334 | 50.046 |
| 0.4883449074074074 | 50.047 |
| 0.48835648148148153 | 50.046 |
| 0.48836805555555557 | 50.047 |
| 0.48837962962962966 | 50.049 |
| 0.4883912037037037 | 50.049 |
| 0.48840277777777774 | 50.05 |
| 0.48841435185185184 | 50.052 |
| 0.4884259259259259 | 50.052 |
| 0.4884375 | 50.054 |
| 0.48844907407407406 | 50.052 |
| 0.48846064814814816 | 50.051 |
| 0.4884722222222222 | 50.05 |
| 0.4884837962962963 | 50.049 |
| 0.48849537037037033 | 50.047 |
| 0.4885069444444445 | 50.044 |
| 0.4885185185185185 | 50.042 |
| 0.4885300925925926 | 50.04 |
| 0.48854166666666665 | 50.038 |
| 0.48855324074074075 | 50.037 |
| 0.4885648148148148 | 50.031 |
| 0.48857638888888894 | 50.028 |
| 0.488587962962963 | 50.026 |
| 0.48859953703703707 | 50.027 |
| 0.4886111111111111 | 50.026 |
| 0.4886226851851852 | 50.028 |
| 0.48863425925925924 | 50.03 |
| 0.4886458333333333 | 50.034 |
| 0.48865740740740743 | 50.037 |
| 0.48866898148148147 | 50.042 |
| 0.48868055555555556 | 50.043 |
| 0.4886921296296296 | 50.049 |
| 0.4887037037037037 | 50.048 |
| 0.48871527777777773 | 50.048 |
| 0.4887268518518519 | 50.047 |
| 0.4887384259259259 | 50.045 |
| 0.48875 | 50.042 |
| 0.48876157407407406 | 50.039 |
| 0.48877314814814815 | 50.037 |
| 0.4887847222222222 | 50.033 |
| 0.48879629629629634 | 50.031 |
| 0.4888078703703704 | 50.03 |
| 0.4888194444444445 | 50.031 |
| 0.4888310185185185 | 50.033 |
| 0.4888425925925926 | 50.034 |
| 0.48885416666666665 | 50.035 |
| 0.4888657407407408 | 50.035 |
| 0.48887731481481483 | 50.033 |
| 0.4888888888888889 | 50.032 |
| 0.48890046296296297 | 50.028 |
| 0.488912037037037 | 50.025 |
| 0.4889236111111111 | 50.022 |
| 0.48893518518518514 | 50.02 |
| 0.4889467592592593 | 50.018 |
| 0.48895833333333333 | 50.015 |
| 0.4889699074074074 | 50.014 |
| 0.48898148148148146 | 50.014 |
| 0.48899305555555556 | 50.013 |
| 0.4890046296296296 | 50.013 |
| 0.48901620370370374 | 50.013 |
| 0.4890277777777778 | 50.014 |
| 0.4890393518518519 | 50.014 |
| 0.4890509259259259 | 50.015 |
| 0.4890625 | 50.019 |
| 0.48907407407407405 | 50.02 |
| 0.4890856481481482 | 50.023 |
| 0.48909722222222224 | 50.026 |
| 0.48910879629629633 | 50.028 |
| 0.48912037037037037 | 50.031 |
| 0.4891319444444444 | 50.034 |
| 0.4891435185185185 | 50.034 |
| 0.48915509259259254 | 50.035 |
| 0.4891666666666667 | 50.036 |
| 0.48917824074074073 | 50.037 |
| 0.4891898148148148 | 50.037 |
| 0.48920138888888887 | 50.035 |
| 0.48921296296296296 | 50.033 |
| 0.489224537037037 | 50.029 |
| 0.48923611111111115 | 50.03 |
| 0.4892476851851852 | 50.03 |
| 0.4892592592592593 | 50.029 |
| 0.4892708333333333 | 50.031 |
| 0.4892824074074074 | 50.029 |
| 0.48929398148148145 | 50.029 |
| 0.4893055555555556 | 50.028 |
| 0.48931712962962964 | 50.027 |
| 0.48932870370370374 | 50.027 |
| 0.4893402777777778 | 50.025 |
| 0.4893518518518518 | 50.021 |
| 0.4893634259259259 | 50.02 |
| 0.48937499999999995 | 50.019 |
| 0.4893865740740741 | 50.017 |
| 0.48939814814814814 | 50.015 |
| 0.48940972222222223 | 50.011 |
| 0.48942129629629627 | 50.008 |
| 0.48943287037037037 | 50.005 |
| 0.4894444444444444 | 50.004 |
| 0.48945601851851855 | 50.002 |
| 0.4894675925925926 | 50.001 |
| 0.4894791666666667 | 50.001 |
| 0.4894907407407407 | 50.002 |
| 0.4895023148148148 | 50.003 |
| 0.48951388888888886 | 50.004 |
| 0.489525462962963 | 50.004 |
| 0.48953703703703705 | 50.006 |
| 0.48954861111111114 | 50.007 |
| 0.4895601851851852 | 50.01 |
| 0.4895717592592593 | 50.011 |
| 0.4895833333333333 | 50.012 |